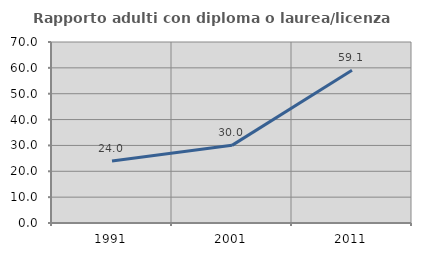
| Category | Rapporto adulti con diploma o laurea/licenza media  |
|---|---|
| 1991.0 | 23.967 |
| 2001.0 | 30.028 |
| 2011.0 | 59.11 |